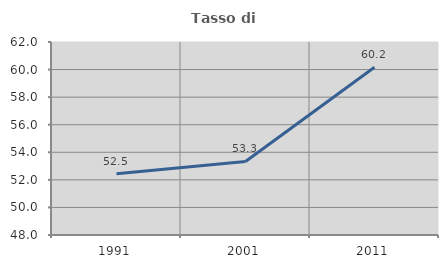
| Category | Tasso di occupazione   |
|---|---|
| 1991.0 | 52.451 |
| 2001.0 | 53.337 |
| 2011.0 | 60.166 |